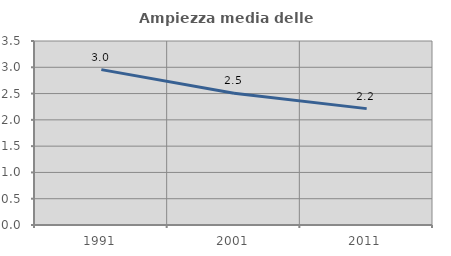
| Category | Ampiezza media delle famiglie |
|---|---|
| 1991.0 | 2.955 |
| 2001.0 | 2.505 |
| 2011.0 | 2.214 |